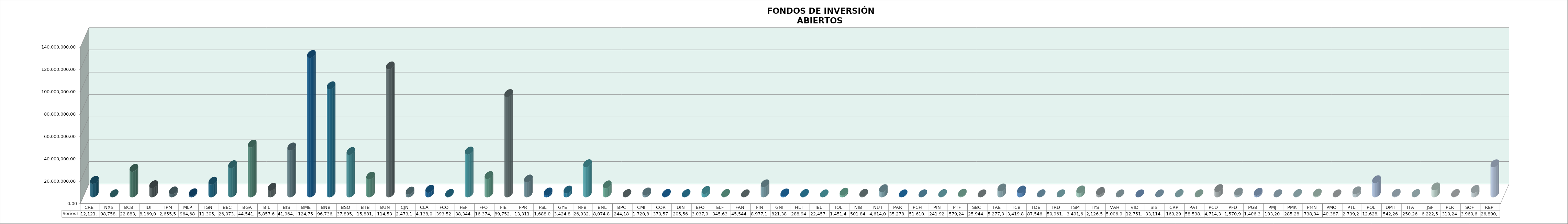
| Category | Series 0 |
|---|---|
| CRE | 12121756.446 |
| NXS | 98758.391 |
| BCB | 22883237.225 |
| IDI | 8169056.723 |
| IPM | 2655570.411 |
| MLP | 964688.776 |
| TGN | 11305258.089 |
| BEC | 26073375.656 |
| BGA | 44541388.224 |
| BIL | 5857632.865 |
| BIS | 41964505.664 |
| BME | 124755782.501 |
| BNB | 96736615.313 |
| BSO | 37895292.878 |
| BTB | 15881300.886 |
| BUN | 114536453.229 |
| CJN | 2473141.331 |
| CLA | 4138090.242 |
| FCO | 393523.274 |
| FEF | 38344839.488 |
| FFO | 16374839.813 |
| FIE | 89752836.462 |
| FPR | 13311001.028 |
| FSL | 1688012.15 |
| GYE | 3424836.52 |
| NFB | 26932616.318 |
| BNL | 8074845.254 |
| BPC | 244181.331 |
| CMI | 1720824 |
| COR | 373573.91 |
| DIN | 205564.128 |
| EFO | 3037979.933 |
| ELF | 345637.407 |
| FAN | 45544.723 |
| FIN | 8977142.509 |
| GNI | 821386.551 |
| HLT | 288942.402 |
| IEL | 22457.055 |
| IOL | 1451423.469 |
| NIB | 501848.032 |
| NUT | 4614061.929 |
| PAR | 35278.207 |
| PCH | 51610.784 |
| PIN | 241920 |
| PTF | 579244.848 |
| SBC | 25944.477 |
| TAE | 5277369.531 |
| TCB | 3419841.945 |
| TDE | 87546.122 |
| TRD | 50961.539 |
| TSM | 3491620.947 |
| TYS | 2126538.88 |
| VAH | 5006.94 |
| VID | 12751.01 |
| SIS | 33114.17 |
| CRP | 169291.316 |
| PAT | 58538.192 |
| PCD | 4714345.582 |
| PFD | 1570926.458 |
| PGB | 1406322.048 |
| PMJ | 103206.414 |
| PMK | 285289.936 |
| PMN | 738049.223 |
| PMO | 40387.732 |
| PTL | 2739214.913 |
| POL | 12628199.477 |
| DMT | 542262.92 |
| ITA | 250263.848 |
| JSF | 6222508.864 |
| PLR | 310249.57 |
| SOF | 3960680.055 |
| REP | 26890919.782 |